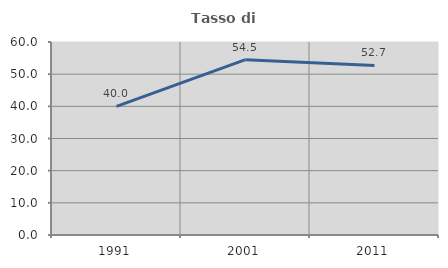
| Category | Tasso di occupazione   |
|---|---|
| 1991.0 | 40 |
| 2001.0 | 54.494 |
| 2011.0 | 52.707 |